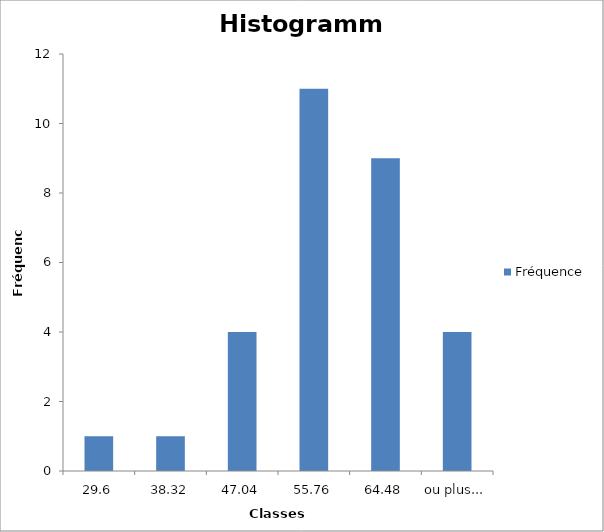
| Category | Fréquence |
|---|---|
| 29,6 | 1 |
| 38,32 | 1 |
| 47,04 | 4 |
| 55,76 | 11 |
| 64,48 | 9 |
| ou plus... | 4 |